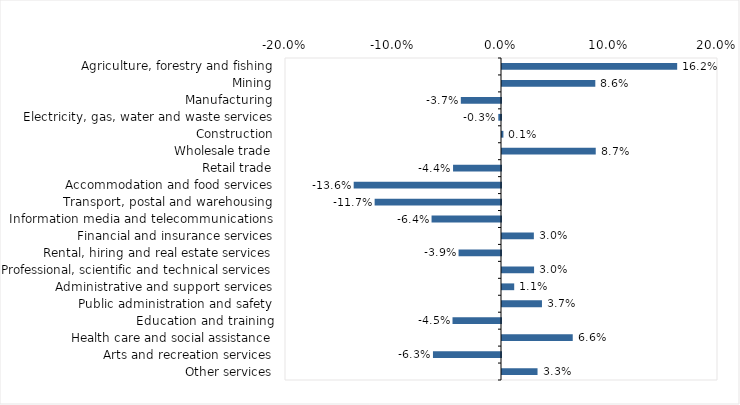
| Category | This week |
|---|---|
| Agriculture, forestry and fishing | 0.162 |
| Mining | 0.086 |
| Manufacturing | -0.037 |
| Electricity, gas, water and waste services | -0.002 |
| Construction | 0.001 |
| Wholesale trade | 0.087 |
| Retail trade | -0.044 |
| Accommodation and food services | -0.136 |
| Transport, postal and warehousing | -0.117 |
| Information media and telecommunications | -0.064 |
| Financial and insurance services | 0.03 |
| Rental, hiring and real estate services | -0.039 |
| Professional, scientific and technical services | 0.03 |
| Administrative and support services | 0.011 |
| Public administration and safety | 0.037 |
| Education and training | -0.045 |
| Health care and social assistance | 0.066 |
| Arts and recreation services | -0.063 |
| Other services | 0.033 |